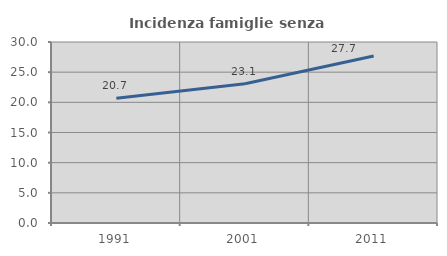
| Category | Incidenza famiglie senza nuclei |
|---|---|
| 1991.0 | 20.69 |
| 2001.0 | 23.077 |
| 2011.0 | 27.684 |